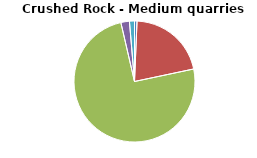
| Category | Series 0 |
|---|---|
| DRILLING AND BLASTING | 1.231 |
| MATERIAL PROCESSING | 38.613 |
| INTERNAL TRANSPORT | 137.265 |
| MATERIAL HANDLING OPERATION | 4.197 |
| WIND EROSION FROM STOCKPILES | 2.457 |